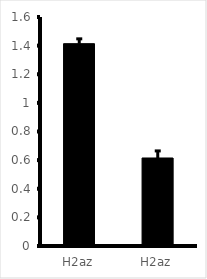
| Category | Series 0 |
|---|---|
| H2az | 1.414 |
| H2az | 0.615 |